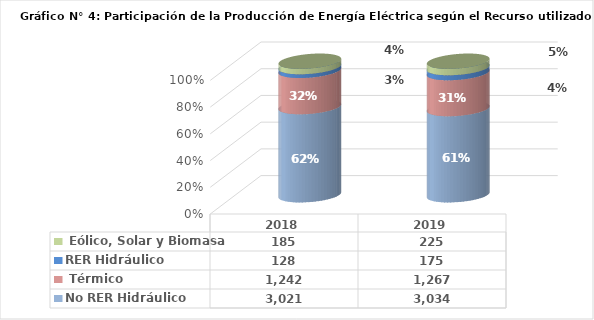
| Category | No RER | RER |
|---|---|---|
| 2018.0 | 1241.873 | 184.528 |
| 2019.0 | 1267.408 | 224.657 |